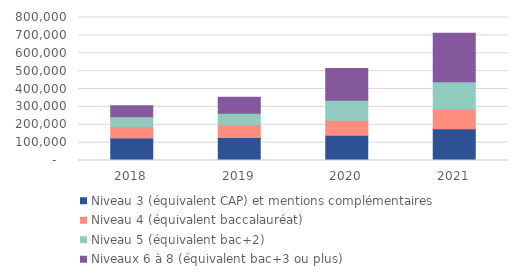
| Category | Niveau 3 (équivalent CAP) et mentions complémentaires | Niveau 4 (équivalent baccalauréat) | Niveau 5 (équivalent bac+2) | Niveaux 6 à 8 (équivalent bac+3 ou plus) |
|---|---|---|---|---|
| 2018.0 | 126380 | 62420 | 55309 | 61786 |
| 2019.0 | 129254 | 68888 | 66089 | 90137 |
| 2020.0 | 140982 | 84595 | 111062 | 178249 |
| 2021.0 | 177230 | 109283 | 154297 | 270863 |